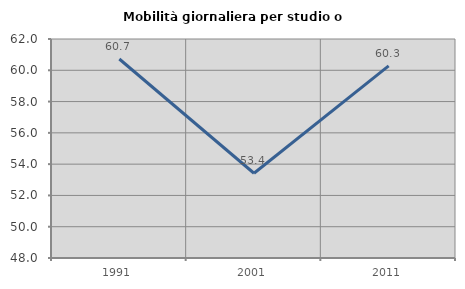
| Category | Mobilità giornaliera per studio o lavoro |
|---|---|
| 1991.0 | 60.721 |
| 2001.0 | 53.419 |
| 2011.0 | 60.278 |